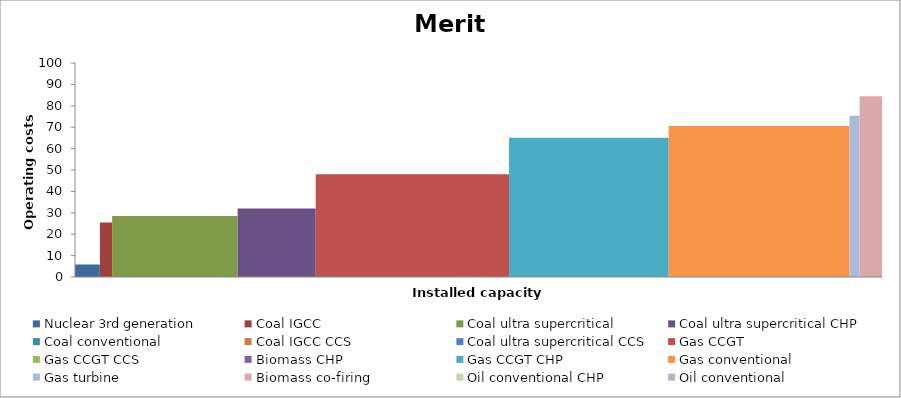
| Category | Nuclear 3rd generation | Coal IGCC | Coal ultra supercritical | Coal ultra supercritical CHP | Coal conventional | Coal IGCC CCS | Coal ultra supercritical CCS | Gas CCGT | Gas CCGT CCS | Biomass CHP | Gas CCGT CHP | Gas conventional | Gas turbine | Biomass co-firing | Oil conventional CHP | Oil conventional |
|---|---|---|---|---|---|---|---|---|---|---|---|---|---|---|---|---|
| 0.0 | 0 | 0 | 0 | 0 | 0 | 0 | 0 | 0 | 0 | 0 | 0 | 0 | 0 | 0 | 0 | 0 |
| 0.0 | 0 | 0 | 0 | 0 | 0 | 0 | 0 | 0 | 0 | 0 | 0 | 0 | 0 | 0 | 0 | 0 |
| 0.0 | 0 | 0 | 0 | 0 | 0 | 0 | 0 | 0 | 0 | 0 | 0 | 0 | 0 | 0 | 0 | 0 |
| 0.0 | 5.89 | 0 | 0 | 0 | 0 | 0 | 0 | 0 | 0 | 0 | 0 | 0 | 0 | 0 | 0 | 0 |
| 473.34375 | 5.89 | 0 | 0 | 0 | 0 | 0 | 0 | 0 | 0 | 0 | 0 | 0 | 0 | 0 | 0 | 0 |
| 473.34375 | 0 | 0 | 0 | 0 | 0 | 0 | 0 | 0 | 0 | 0 | 0 | 0 | 0 | 0 | 0 | 0 |
| 473.34375 | 0 | 25.445 | 0 | 0 | 0 | 0 | 0 | 0 | 0 | 0 | 0 | 0 | 0 | 0 | 0 | 0 |
| 705.69072 | 0 | 25.445 | 0 | 0 | 0 | 0 | 0 | 0 | 0 | 0 | 0 | 0 | 0 | 0 | 0 | 0 |
| 705.69072 | 0 | 0 | 0 | 0 | 0 | 0 | 0 | 0 | 0 | 0 | 0 | 0 | 0 | 0 | 0 | 0 |
| 705.69072 | 0 | 0 | 28.552 | 0 | 0 | 0 | 0 | 0 | 0 | 0 | 0 | 0 | 0 | 0 | 0 | 0 |
| 3093.246264 | 0 | 0 | 28.552 | 0 | 0 | 0 | 0 | 0 | 0 | 0 | 0 | 0 | 0 | 0 | 0 | 0 |
| 3093.246264 | 0 | 0 | 0 | 0 | 0 | 0 | 0 | 0 | 0 | 0 | 0 | 0 | 0 | 0 | 0 | 0 |
| 3093.246264 | 0 | 0 | 0 | 31.975 | 0 | 0 | 0 | 0 | 0 | 0 | 0 | 0 | 0 | 0 | 0 | 0 |
| 4578.04624 | 0 | 0 | 0 | 31.975 | 0 | 0 | 0 | 0 | 0 | 0 | 0 | 0 | 0 | 0 | 0 | 0 |
| 4578.04624 | 0 | 0 | 0 | 0 | 0 | 0 | 0 | 0 | 0 | 0 | 0 | 0 | 0 | 0 | 0 | 0 |
| 4578.04624 | 0 | 0 | 0 | 0 | 32.524 | 0 | 0 | 0 | 0 | 0 | 0 | 0 | 0 | 0 | 0 | 0 |
| 4578.04624 | 0 | 0 | 0 | 0 | 32.524 | 0 | 0 | 0 | 0 | 0 | 0 | 0 | 0 | 0 | 0 | 0 |
| 4578.04624 | 0 | 0 | 0 | 0 | 0 | 0 | 0 | 0 | 0 | 0 | 0 | 0 | 0 | 0 | 0 | 0 |
| 4578.04624 | 0 | 0 | 0 | 0 | 0 | 33.305 | 0 | 0 | 0 | 0 | 0 | 0 | 0 | 0 | 0 | 0 |
| 4578.04624 | 0 | 0 | 0 | 0 | 0 | 33.305 | 0 | 0 | 0 | 0 | 0 | 0 | 0 | 0 | 0 | 0 |
| 4578.04624 | 0 | 0 | 0 | 0 | 0 | 0 | 0 | 0 | 0 | 0 | 0 | 0 | 0 | 0 | 0 | 0 |
| 4578.04624 | 0 | 0 | 0 | 0 | 0 | 0 | 37.629 | 0 | 0 | 0 | 0 | 0 | 0 | 0 | 0 | 0 |
| 4578.04624 | 0 | 0 | 0 | 0 | 0 | 0 | 37.629 | 0 | 0 | 0 | 0 | 0 | 0 | 0 | 0 | 0 |
| 4578.04624 | 0 | 0 | 0 | 0 | 0 | 0 | 0 | 0 | 0 | 0 | 0 | 0 | 0 | 0 | 0 | 0 |
| 4578.04624 | 0 | 0 | 0 | 0 | 0 | 0 | 0 | 47.98 | 0 | 0 | 0 | 0 | 0 | 0 | 0 | 0 |
| 8253.35239 | 0 | 0 | 0 | 0 | 0 | 0 | 0 | 47.98 | 0 | 0 | 0 | 0 | 0 | 0 | 0 | 0 |
| 8253.35239 | 0 | 0 | 0 | 0 | 0 | 0 | 0 | 0 | 0 | 0 | 0 | 0 | 0 | 0 | 0 | 0 |
| 8253.35239 | 0 | 0 | 0 | 0 | 0 | 0 | 0 | 0 | 61.059 | 0 | 0 | 0 | 0 | 0 | 0 | 0 |
| 8253.35239 | 0 | 0 | 0 | 0 | 0 | 0 | 0 | 0 | 61.059 | 0 | 0 | 0 | 0 | 0 | 0 | 0 |
| 8253.35239 | 0 | 0 | 0 | 0 | 0 | 0 | 0 | 0 | 0 | 0 | 0 | 0 | 0 | 0 | 0 | 0 |
| 8253.35239 | 0 | 0 | 0 | 0 | 0 | 0 | 0 | 0 | 0 | 61.6 | 0 | 0 | 0 | 0 | 0 | 0 |
| 8253.35239 | 0 | 0 | 0 | 0 | 0 | 0 | 0 | 0 | 0 | 61.6 | 0 | 0 | 0 | 0 | 0 | 0 |
| 8253.35239 | 0 | 0 | 0 | 0 | 0 | 0 | 0 | 0 | 0 | 0 | 0 | 0 | 0 | 0 | 0 | 0 |
| 8253.35239 | 0 | 0 | 0 | 0 | 0 | 0 | 0 | 0 | 0 | 0 | 65.055 | 0 | 0 | 0 | 0 | 0 |
| 11289.10747 | 0 | 0 | 0 | 0 | 0 | 0 | 0 | 0 | 0 | 0 | 65.055 | 0 | 0 | 0 | 0 | 0 |
| 11289.10747 | 0 | 0 | 0 | 0 | 0 | 0 | 0 | 0 | 0 | 0 | 0 | 0 | 0 | 0 | 0 | 0 |
| 11289.10747 | 0 | 0 | 0 | 0 | 0 | 0 | 0 | 0 | 0 | 0 | 0 | 70.619 | 0 | 0 | 0 | 0 |
| 14726.844877 | 0 | 0 | 0 | 0 | 0 | 0 | 0 | 0 | 0 | 0 | 0 | 70.619 | 0 | 0 | 0 | 0 |
| 14726.844877 | 0 | 0 | 0 | 0 | 0 | 0 | 0 | 0 | 0 | 0 | 0 | 0 | 0 | 0 | 0 | 0 |
| 14726.844877 | 0 | 0 | 0 | 0 | 0 | 0 | 0 | 0 | 0 | 0 | 0 | 0 | 75.319 | 0 | 0 | 0 |
| 14919.375462 | 0 | 0 | 0 | 0 | 0 | 0 | 0 | 0 | 0 | 0 | 0 | 0 | 75.319 | 0 | 0 | 0 |
| 14919.375462 | 0 | 0 | 0 | 0 | 0 | 0 | 0 | 0 | 0 | 0 | 0 | 0 | 0 | 0 | 0 | 0 |
| 14919.375462 | 0 | 0 | 0 | 0 | 0 | 0 | 0 | 0 | 0 | 0 | 0 | 0 | 0 | 84.497 | 0 | 0 |
| 15345.497583 | 0 | 0 | 0 | 0 | 0 | 0 | 0 | 0 | 0 | 0 | 0 | 0 | 0 | 84.497 | 0 | 0 |
| 15345.497583 | 0 | 0 | 0 | 0 | 0 | 0 | 0 | 0 | 0 | 0 | 0 | 0 | 0 | 0 | 0 | 0 |
| 15345.497583 | 0 | 0 | 0 | 0 | 0 | 0 | 0 | 0 | 0 | 0 | 0 | 0 | 0 | 0 | 117.449 | 0 |
| 15345.497583 | 0 | 0 | 0 | 0 | 0 | 0 | 0 | 0 | 0 | 0 | 0 | 0 | 0 | 0 | 117.449 | 0 |
| 15345.497583 | 0 | 0 | 0 | 0 | 0 | 0 | 0 | 0 | 0 | 0 | 0 | 0 | 0 | 0 | 0 | 0 |
| 15345.497583 | 0 | 0 | 0 | 0 | 0 | 0 | 0 | 0 | 0 | 0 | 0 | 0 | 0 | 0 | 0 | 139.085 |
| 15345.497583 | 0 | 0 | 0 | 0 | 0 | 0 | 0 | 0 | 0 | 0 | 0 | 0 | 0 | 0 | 0 | 139.085 |